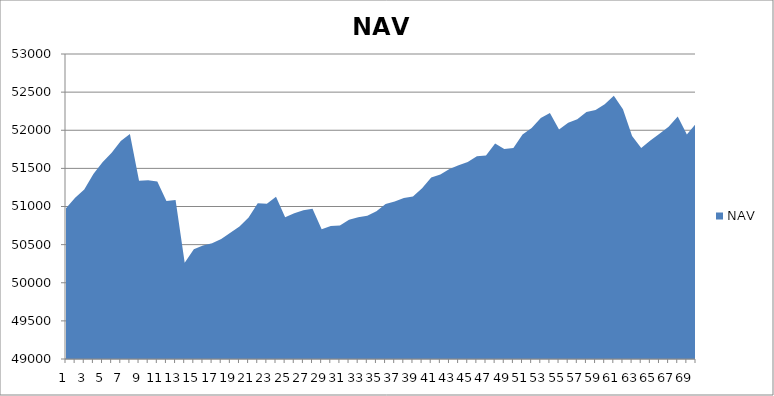
| Category | NAV |
|---|---|
| 0 | 50975.413 |
| 1 | 51115.874 |
| 2 | 51223.542 |
| 3 | 51427.364 |
| 4 | 51580.567 |
| 5 | 51704.692 |
| 6 | 51858.016 |
| 7 | 51951.766 |
| 8 | 51336.067 |
| 9 | 51345.356 |
| 10 | 51328.667 |
| 11 | 51072.985 |
| 12 | 51085.199 |
| 13 | 50261.67 |
| 14 | 50438.394 |
| 15 | 50489.896 |
| 16 | 50518.251 |
| 17 | 50572.468 |
| 18 | 50655.55 |
| 19 | 50737.787 |
| 20 | 50856.035 |
| 21 | 51041.806 |
| 22 | 51034.925 |
| 23 | 51128.589 |
| 24 | 50859.456 |
| 25 | 50911.137 |
| 26 | 50950.007 |
| 27 | 50970.175 |
| 28 | 50701.326 |
| 29 | 50743.495 |
| 30 | 50751.546 |
| 31 | 50826.725 |
| 32 | 50860.533 |
| 33 | 50879.283 |
| 34 | 50936.644 |
| 35 | 51031.381 |
| 36 | 51065.306 |
| 37 | 51109.987 |
| 38 | 51132.251 |
| 39 | 51238.242 |
| 40 | 51380.786 |
| 41 | 51420.042 |
| 42 | 51490.787 |
| 43 | 51541.14 |
| 44 | 51584.924 |
| 45 | 51657.998 |
| 46 | 51667.348 |
| 47 | 51825.763 |
| 48 | 51755.412 |
| 49 | 51767.57 |
| 50 | 51945.15 |
| 51 | 52028.391 |
| 52 | 52160.744 |
| 53 | 52227.009 |
| 54 | 52009.927 |
| 55 | 52099.094 |
| 56 | 52144.26 |
| 57 | 52240.689 |
| 58 | 52266.163 |
| 59 | 52339.405 |
| 60 | 52453.236 |
| 61 | 52275.154 |
| 62 | 51926 |
| 63 | 51766.425 |
| 64 | 51865.11 |
| 65 | 51955.727 |
| 66 | 52045.452 |
| 67 | 52179.744 |
| 68 | 51944.5 |
| 69 | 52088.896 |